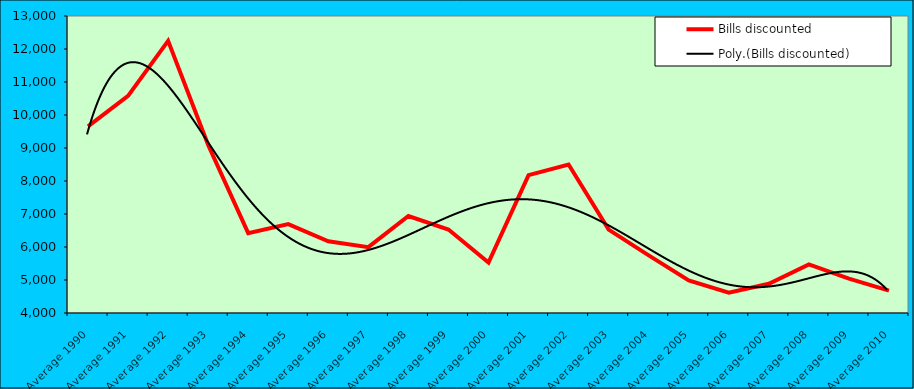
| Category | Bills discounted |
|---|---|
| Average 1990 | 9655.833 |
| Average 1991 | 10577.833 |
| Average 1992 | 12245.5 |
| Average 1993 | 9091.417 |
| Average 1994 | 6421.417 |
| Average 1995 | 6692.5 |
| Average 1996 | 6175.25 |
| Average 1997 | 5996.167 |
| Average 1998 | 6938.167 |
| Average 1999 | 6530.909 |
| Average 2000 | 5530.583 |
| Average 2001 | 8177 |
| Average 2002 | 8501.333 |
| Average 2003 | 6526.417 |
| Average 2004 | 5747 |
| Average 2005 | 4985.583 |
| Average 2006 | 4617.083 |
| Average 2007 | 4884.833 |
| Average 2008 | 5474.917 |
| Average 2009 | 5040.417 |
| Average 2010 | 4678.571 |